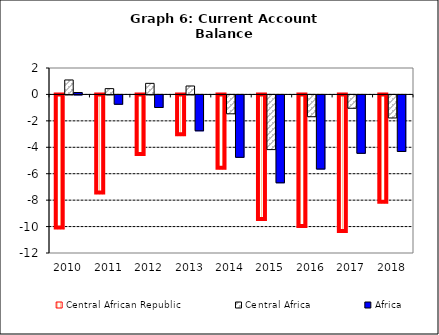
| Category | Central African Republic | Central Africa | Africa |
|---|---|---|---|
| 2010.0 | -10.151 | 1.095 | 0.144 |
| 2011.0 | -7.503 | 0.439 | -0.706 |
| 2012.0 | -4.585 | 0.839 | -0.95 |
| 2013.0 | -3.087 | 0.638 | -2.715 |
| 2014.0 | -5.616 | -1.429 | -4.722 |
| 2015.0 | -9.5 | -4.138 | -6.65 |
| 2016.0 | -10.04 | -1.65 | -5.608 |
| 2017.0 | -10.412 | -1.011 | -4.418 |
| 2018.0 | -8.193 | -1.744 | -4.278 |